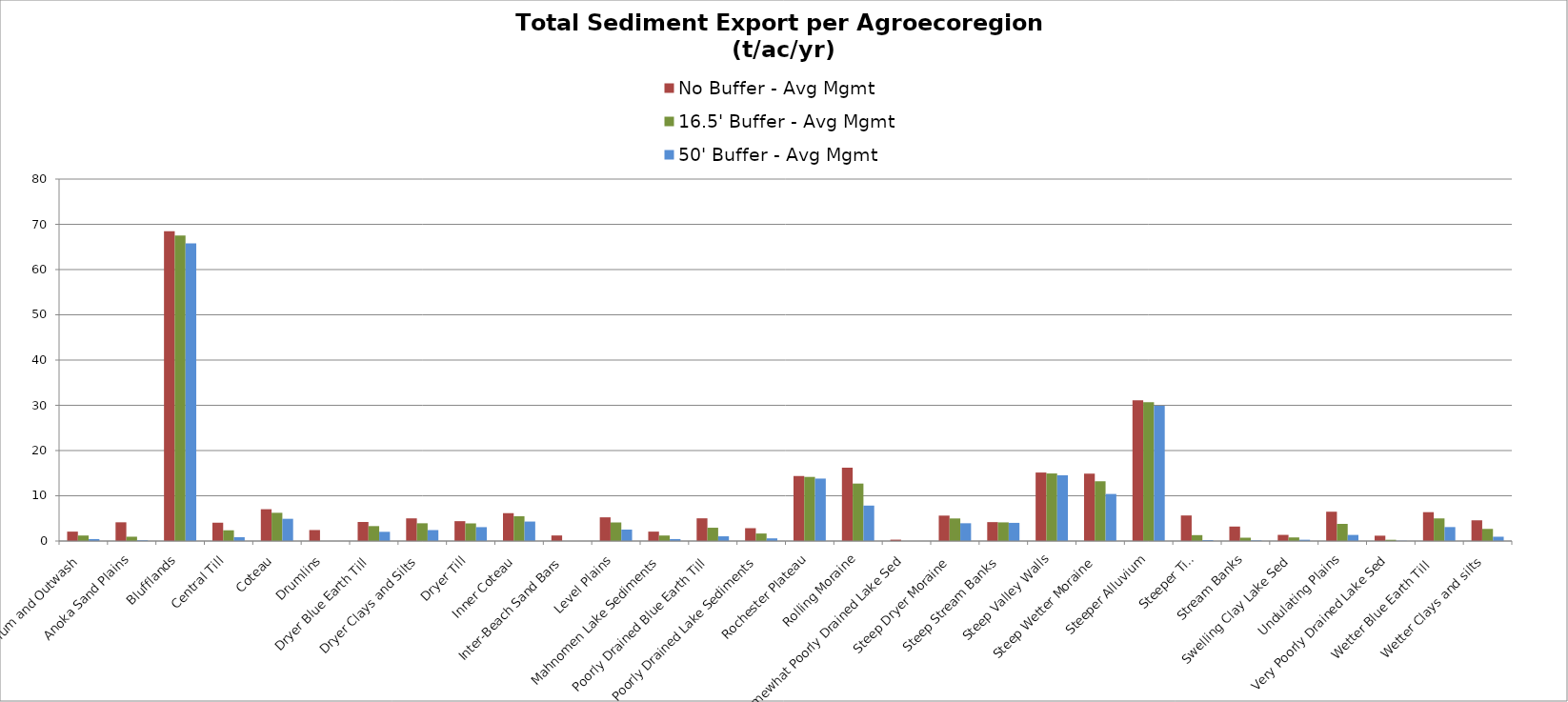
| Category | No Buffer - Avg Mgmt | 16.5' Buffer - Avg Mgmt | 50' Buffer - Avg Mgmt |
|---|---|---|---|
| Alluvium and Outwash | 2.08 | 1.218 | 0.433 |
| Anoka Sand Plains | 4.14 | 0.955 | 0.158 |
| Blufflands | 68.47 | 67.521 | 65.767 |
| Central Till | 4.05 | 2.372 | 0.842 |
| Coteau | 7.03 | 6.241 | 4.914 |
| Drumlins | 2.43 | 0 | 0 |
| Dryer Blue Earth Till | 4.21 | 3.299 | 2.034 |
| Dryer Clays and Silts | 5.01 | 3.925 | 2.421 |
| Dryer Till | 4.39 | 3.897 | 3.069 |
| Inner Coteau | 6.16 | 5.468 | 4.306 |
| Inter-Beach Sand Bars | 1.23 | 0 | 0 |
| Level Plains | 5.24 | 4.106 | 2.532 |
| Mahnomen Lake Sediments | 2.08 | 1.218 | 0.433 |
| Poorly Drained Blue Earth Till | 5.02 | 2.94 | 1.044 |
| Poorly Drained Lake Sediments | 2.84 | 1.663 | 0.591 |
| Rochester Plateau | 14.37 | 14.171 | 13.803 |
| Rolling Moraine | 16.21 | 12.7 | 7.833 |
| Somewhat Poorly Drained Lake Sed | 0.3 | 0 | 0 |
| Steep Dryer Moraine | 5.62 | 4.989 | 3.928 |
| Steep Stream Banks | 4.18 | 4.122 | 4.015 |
| Steep Valley Walls | 15.14 | 14.93 | 14.542 |
| Steep Wetter Moraine | 14.88 | 13.209 | 10.401 |
| Steeper Alluvium | 31.13 | 30.698 | 29.901 |
| Steeper Till | 5.65 | 1.303 | 0.216 |
| Stream Banks | 3.2 | 0.738 | 0.122 |
| Swelling Clay Lake Sed | 1.36 | 0.796 | 0.283 |
| Undulating Plains | 6.48 | 3.795 | 1.348 |
| Very Poorly Drained Lake Sed | 1.18 | 0.272 | 0.045 |
| Wetter Blue Earth Till  | 6.38 | 4.999 | 3.083 |
| Wetter Clays and silts | 4.58 | 2.682 | 0.953 |